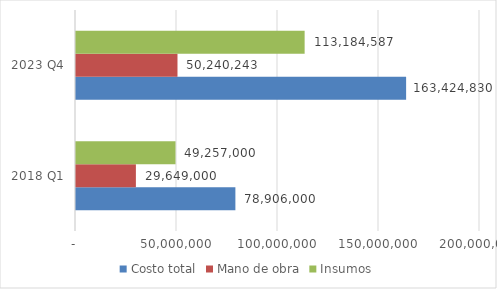
| Category | Costo total | Mano de obra | Insumos |
|---|---|---|---|
| 2018 Q1 | 78906000 | 29649000 | 49257000 |
| 2023 Q4 | 163424829.634 | 50240243 | 113184586.634 |